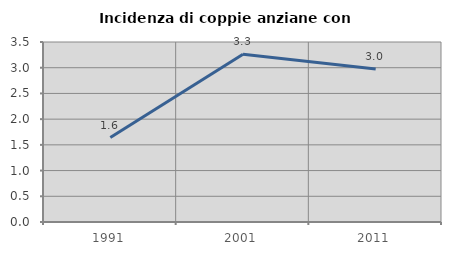
| Category | Incidenza di coppie anziane con figli |
|---|---|
| 1991.0 | 1.641 |
| 2001.0 | 3.262 |
| 2011.0 | 2.977 |